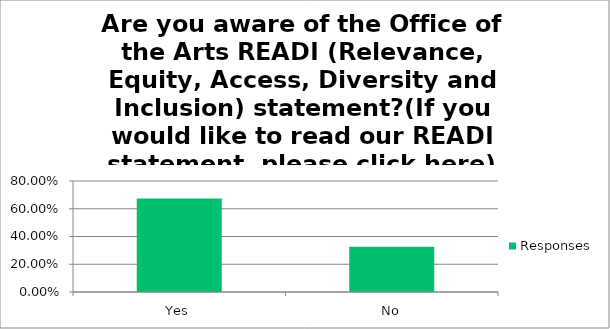
| Category | Responses |
|---|---|
| Yes | 0.673 |
| No | 0.327 |